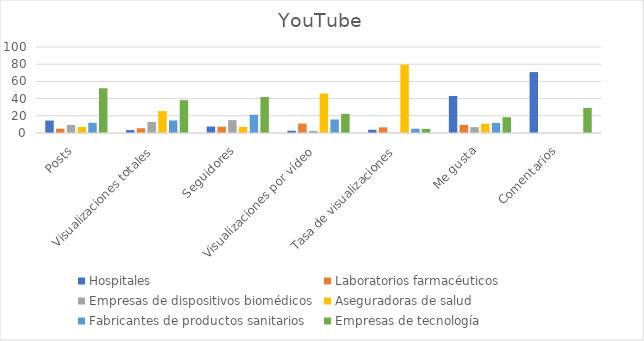
| Category | Hospitales | Laboratorios farmacéuticos | Empresas de dispositivos biomédicos | Aseguradoras de salud | Fabricantes de productos sanitarios | Empresas de tecnología |
|---|---|---|---|---|---|---|
| Posts | 14.463 | 5.005 | 9.469 | 7.078 | 11.939 | 52.046 |
| Visualizaciones totales | 3.342 | 5.566 | 12.911 | 25.501 | 14.553 | 38.126 |
| Seguidores | 7.502 | 7.281 | 14.993 | 7.073 | 21.258 | 41.893 |
| Visualizaciones por vídeo | 2.69 | 10.984 | 2.44 | 45.949 | 15.734 | 22.204 |
| Tasa de visualizaciones | 3.789 | 6.601 | 0.292 | 79.583 | 4.973 | 4.762 |
| Me gusta | 43.013 | 9.413 | 6.792 | 10.787 | 11.602 | 18.394 |
| Comentarios | 70.822 | 0 | 0 | 0 | 0 | 29.178 |